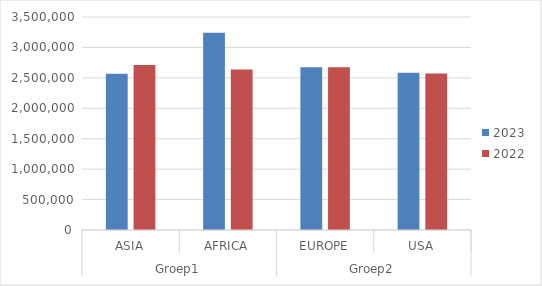
| Category | 2023 | 2022 |
|---|---|---|
| 0 | 2566978 | 2711156 |
| 1 | 3240921 | 2635979 |
| 2 | 2674096 | 2675496 |
| 3 | 2584865 | 2569892 |